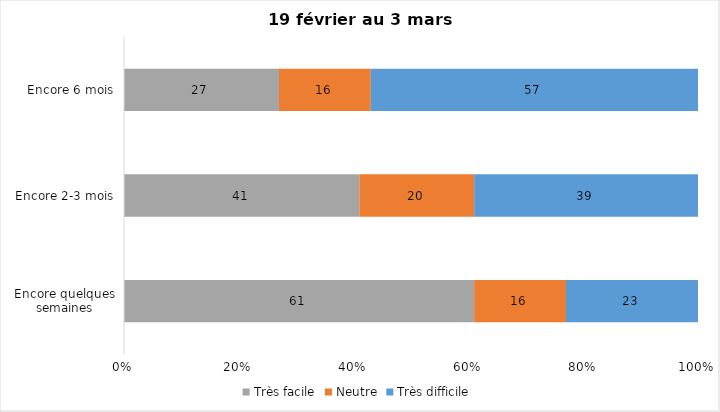
| Category | Très facile | Neutre | Très difficile |
|---|---|---|---|
| Encore quelques semaines | 61 | 16 | 23 |
| Encore 2-3 mois | 41 | 20 | 39 |
| Encore 6 mois | 27 | 16 | 57 |